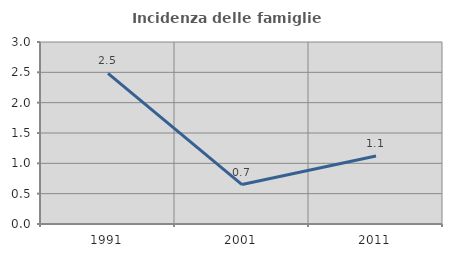
| Category | Incidenza delle famiglie numerose |
|---|---|
| 1991.0 | 2.483 |
| 2001.0 | 0.65 |
| 2011.0 | 1.121 |